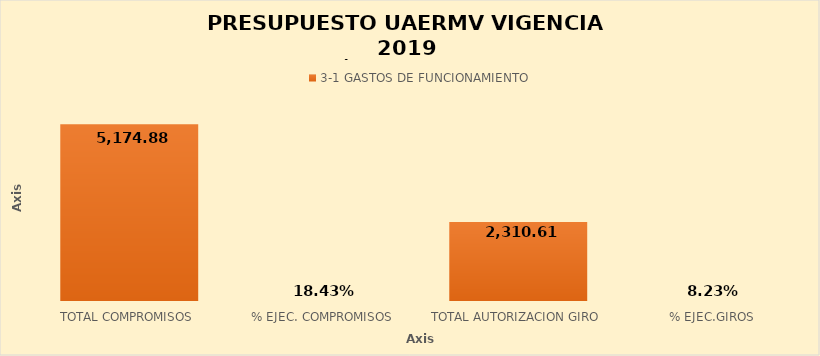
| Category | 3-1 |
|---|---|
| TOTAL COMPROMISOS | 5174.885 |
| % EJEC. COMPROMISOS | 0.184 |
| TOTAL AUTORIZACION GIRO | 2310.607 |
| % EJEC.GIROS | 0.082 |